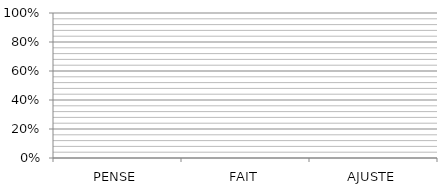
| Category | Series 0 | Series 1 | Series 2 | Series 3 |
|---|---|---|---|---|
| PENSE | 0 | 0 | 0 | 0 |
| FAIT | 0 | 0 | 0 | 0 |
| AJUSTE | 0 | 0 | 0 | 0 |